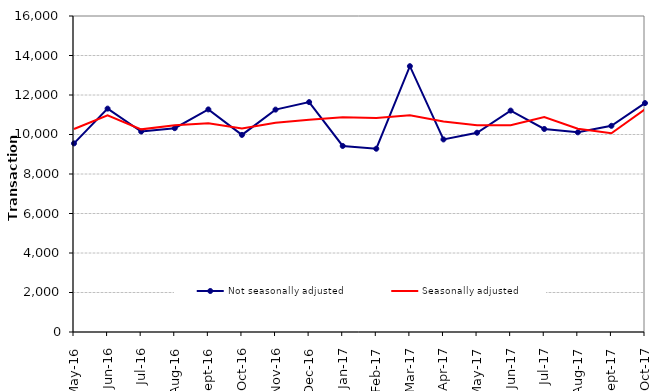
| Category | Not seasonally adjusted | Seasonally adjusted |
|---|---|---|
| 2016-05-01 | 9550 | 10280 |
| 2016-06-01 | 11310 | 10970 |
| 2016-07-01 | 10150 | 10260 |
| 2016-08-01 | 10320 | 10470 |
| 2016-09-01 | 11270 | 10570 |
| 2016-10-01 | 9980 | 10300 |
| 2016-11-01 | 11260 | 10600 |
| 2016-12-01 | 11640 | 10750 |
| 2017-01-01 | 9420 | 10870 |
| 2017-02-01 | 9280 | 10840 |
| 2017-03-01 | 13460 | 10980 |
| 2017-04-01 | 9750 | 10660 |
| 2017-05-01 | 10090 | 10470 |
| 2017-06-01 | 11210 | 10470 |
| 2017-07-01 | 10280 | 10880 |
| 2017-08-01 | 10110 | 10290 |
| 2017-09-01 | 10440 | 10060 |
| 2017-10-01 | 11590 | 11280 |